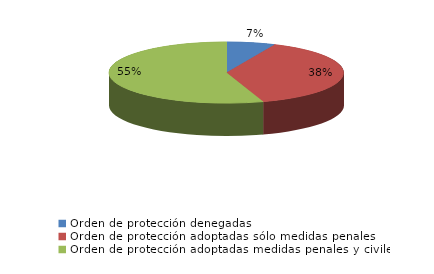
| Category | Series 0 |
|---|---|
| Orden de protección denegadas | 39 |
| Orden de protección adoptadas sólo medidas penales | 224 |
| Orden de protección adoptadas medidas penales y civiles | 322 |